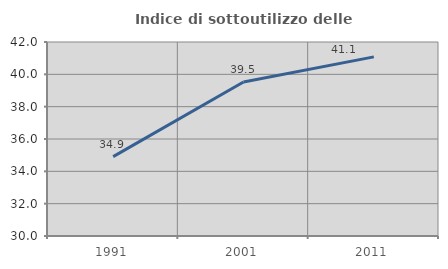
| Category | Indice di sottoutilizzo delle abitazioni  |
|---|---|
| 1991.0 | 34.908 |
| 2001.0 | 39.524 |
| 2011.0 | 41.081 |